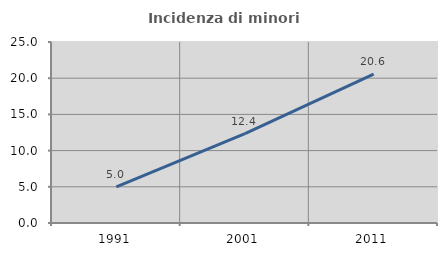
| Category | Incidenza di minori stranieri |
|---|---|
| 1991.0 | 5 |
| 2001.0 | 12.36 |
| 2011.0 | 20.576 |